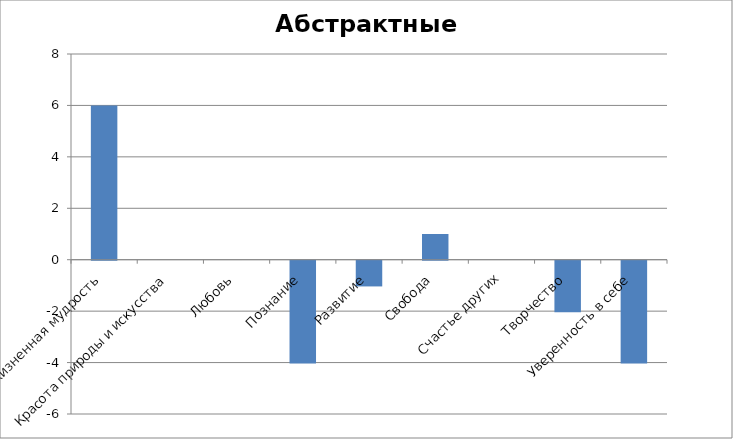
| Category | Абстрактные ценности |
|---|---|
| Жизненная мудрость | 6 |
| Красота природы и искусства | 0 |
| Любовь | 0 |
| Познание | -4 |
| Развитие | -1 |
| Свобода | 1 |
| Счастье других | 0 |
| Творчество | -2 |
| Уверенность в себе | -4 |